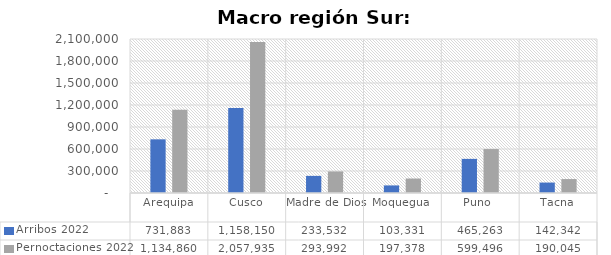
| Category | Arribos 2022 | Pernoctaciones 2022 |
|---|---|---|
| Arequipa | 731883 | 1134860 |
| Cusco | 1158150 | 2057935 |
| Madre de Dios | 233532 | 293992 |
| Moquegua | 103331 | 197378 |
| Puno  | 465263 | 599496 |
| Tacna | 142342 | 190045 |